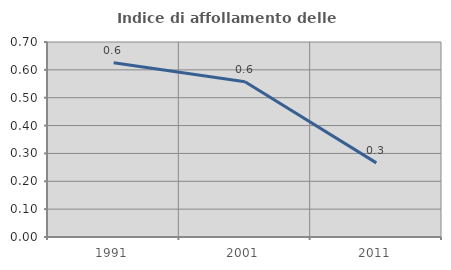
| Category | Indice di affollamento delle abitazioni  |
|---|---|
| 1991.0 | 0.625 |
| 2001.0 | 0.557 |
| 2011.0 | 0.266 |